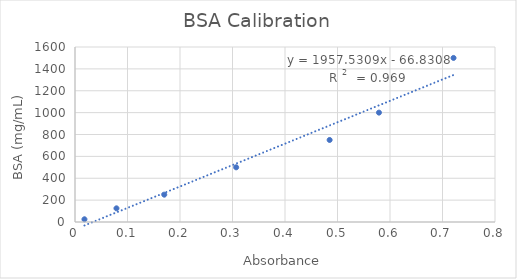
| Category | Series 0 |
|---|---|
| 0.7210000000000001 | 1500 |
| 0.579 | 1000 |
| 0.48500000000000004 | 750 |
| 0.307 | 500 |
| 0.17000000000000004 | 250 |
| 0.07900000000000001 | 125 |
| 0.018000000000000016 | 25 |